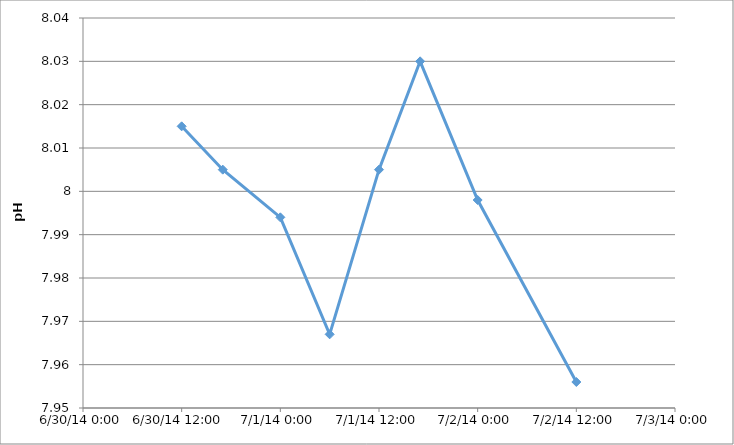
| Category | Series 0 |
|---|---|
| 41820.5 | 8.015 |
| 41820.708333333336 | 8.005 |
| 41821.0 | 7.994 |
| 41821.25 | 7.967 |
| 41821.5 | 8.005 |
| 41821.708333333336 | 8.03 |
| 41822.0 | 7.998 |
| 41822.5 | 7.956 |